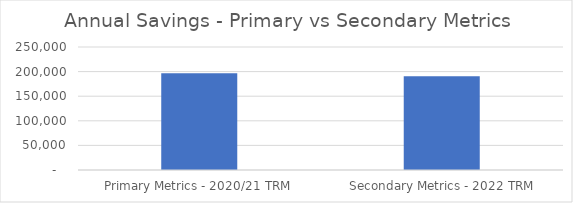
| Category | Series 0 |
|---|---|
|  Primary Metrics - 2020/21 TRM  | 196407.869 |
|  Secondary Metrics - 2022 TRM  | 190701.206 |